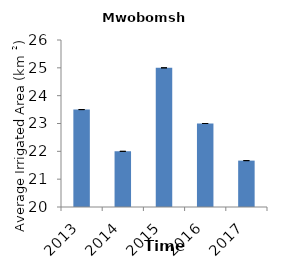
| Category | Mwobomshi |
|---|---|
| 2013.0 | 23.5 |
| 2014.0 | 22 |
| 2015.0 | 25 |
| 2016.0 | 23 |
| 2017.0 | 21.667 |